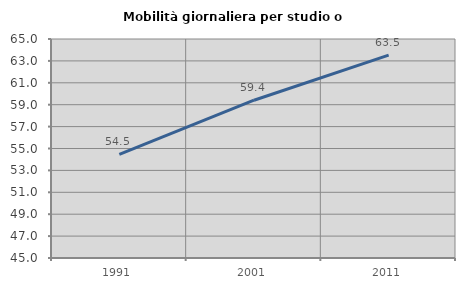
| Category | Mobilità giornaliera per studio o lavoro |
|---|---|
| 1991.0 | 54.455 |
| 2001.0 | 59.409 |
| 2011.0 | 63.525 |